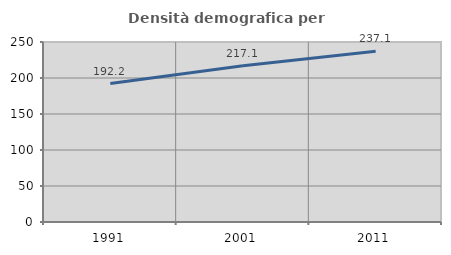
| Category | Densità demografica |
|---|---|
| 1991.0 | 192.222 |
| 2001.0 | 217.08 |
| 2011.0 | 237.104 |